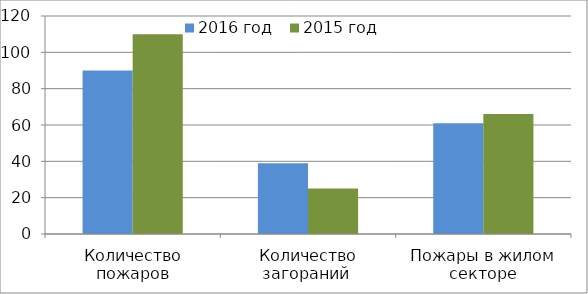
| Category | 2016 год | 2015 год |
|---|---|---|
| Количество пожаров | 90 | 110 |
| Количество загораний  | 39 | 25 |
| Пожары в жилом секторе | 61 | 66 |